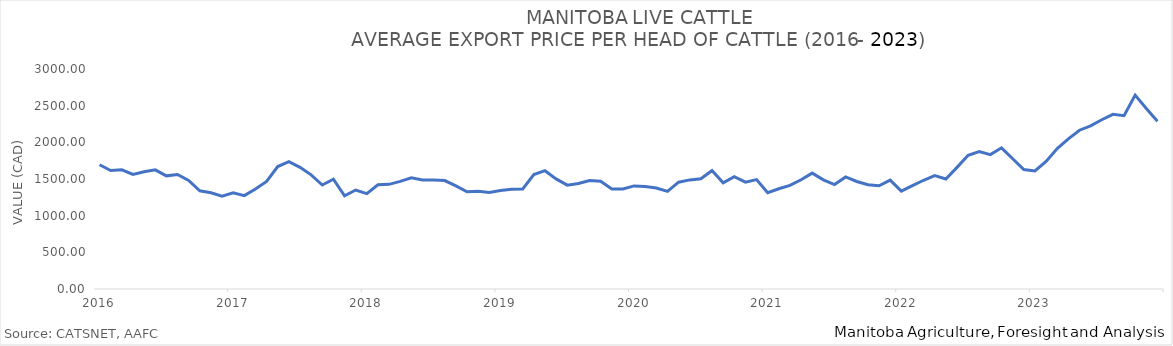
| Category | Total Cattle P |
|---|---|
| 2016-01-01 | 1693.831 |
| 2016-02-01 | 1615.24 |
| 2016-03-01 | 1624.43 |
| 2016-04-01 | 1563.43 |
| 2016-05-01 | 1599.414 |
| 2016-06-01 | 1624.519 |
| 2016-07-01 | 1542.974 |
| 2016-08-01 | 1561.843 |
| 2016-09-01 | 1481.102 |
| 2016-10-01 | 1339.016 |
| 2016-11-01 | 1312.88 |
| 2016-12-01 | 1265.566 |
| 2017-01-01 | 1310.673 |
| 2017-02-01 | 1273.713 |
| 2017-03-01 | 1362.561 |
| 2017-04-01 | 1466.192 |
| 2017-05-01 | 1670.369 |
| 2017-06-01 | 1736.551 |
| 2017-07-01 | 1659.574 |
| 2017-08-01 | 1556.616 |
| 2017-09-01 | 1417.754 |
| 2017-10-01 | 1497.78 |
| 2017-11-01 | 1270.68 |
| 2017-12-01 | 1349.417 |
| 2018-01-01 | 1301.272 |
| 2018-02-01 | 1421.801 |
| 2018-03-01 | 1426.738 |
| 2018-04-01 | 1468.174 |
| 2018-05-01 | 1515.145 |
| 2018-06-01 | 1486.388 |
| 2018-07-01 | 1486.406 |
| 2018-08-01 | 1478.497 |
| 2018-09-01 | 1406.464 |
| 2018-10-01 | 1325.978 |
| 2018-11-01 | 1333.367 |
| 2018-12-01 | 1317.49 |
| 2019-01-01 | 1343.2 |
| 2019-02-01 | 1361.669 |
| 2019-03-01 | 1364.428 |
| 2019-04-01 | 1559.568 |
| 2019-05-01 | 1613.501 |
| 2019-06-01 | 1501.805 |
| 2019-07-01 | 1416.037 |
| 2019-08-01 | 1439.377 |
| 2019-09-01 | 1478.4 |
| 2019-10-01 | 1469.706 |
| 2019-11-01 | 1364.128 |
| 2019-12-01 | 1365.114 |
| 2020-01-01 | 1405.991 |
| 2020-02-01 | 1398.961 |
| 2020-03-01 | 1377.358 |
| 2020-04-01 | 1330.925 |
| 2020-05-01 | 1456.821 |
| 2020-06-01 | 1487.768 |
| 2020-07-01 | 1502.643 |
| 2020-08-01 | 1615.227 |
| 2020-09-01 | 1447.121 |
| 2020-10-01 | 1531.009 |
| 2020-11-01 | 1457.158 |
| 2020-12-01 | 1492.219 |
| 2021-01-01 | 1314.19 |
| 2021-02-01 | 1367.038 |
| 2021-03-01 | 1412.154 |
| 2021-04-01 | 1489.614 |
| 2021-05-01 | 1580.267 |
| 2021-06-01 | 1489.155 |
| 2021-07-01 | 1423.62 |
| 2021-08-01 | 1527.702 |
| 2021-09-01 | 1466.038 |
| 2021-10-01 | 1420.761 |
| 2021-11-01 | 1407.086 |
| 2021-12-01 | 1484.79 |
| 2022-01-01 | 1335.457 |
| 2022-02-01 | 1410.72 |
| 2022-03-01 | 1482.935 |
| 2022-04-01 | 1545.55 |
| 2022-05-01 | 1499.459 |
| 2022-06-01 | 1658.417 |
| 2022-07-01 | 1823.76 |
| 2022-08-01 | 1875.399 |
| 2022-09-01 | 1832.672 |
| 2022-10-01 | 1925.165 |
| 2022-11-01 | 1775.625 |
| 2022-12-01 | 1628.02 |
| 2023-01-01 | 1609.373 |
| 2023-02-01 | 1739.635 |
| 2023-03-01 | 1915.44 |
| 2023-04-01 | 2046.784 |
| 2023-05-01 | 2165.437 |
| 2023-06-01 | 2224.783 |
| 2023-07-01 | 2308.498 |
| 2023-08-01 | 2381.37 |
| 2023-09-01 | 2364.173 |
| 2023-10-01 | 2644.838 |
| 2023-11-01 | 2461.82 |
| 2023-12-01 | 2287.43 |